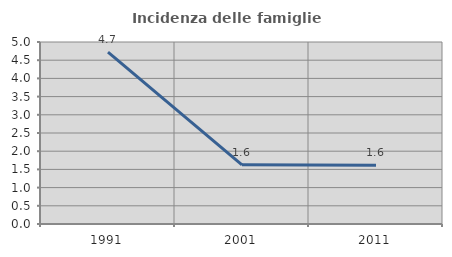
| Category | Incidenza delle famiglie numerose |
|---|---|
| 1991.0 | 4.721 |
| 2001.0 | 1.627 |
| 2011.0 | 1.614 |